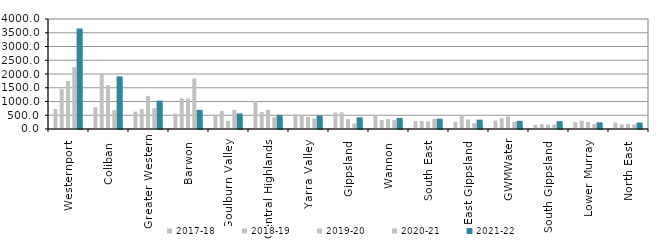
| Category | 2017-18 | 2018-19 | 2019-20 | 2020-21 | 2021-22 |
|---|---|---|---|---|---|
| Westernport  | 729.938 | 1451.118 | 1746.615 | 2248.75 | 3583.143 |
| Coliban  | 789.182 | 2020.653 | 1598.887 | 683.093 | 1841.189 |
| Greater Western | 630.923 | 725.361 | 1201.258 | 755.099 | 961.988 |
| Barwon  | 557.536 | 1117 | 1112.623 | 1837.607 | 624.006 |
| Goulburn Valley  | 487.173 | 657.018 | 297.876 | 698.438 | 494.216 |
| Central Highlands  | 1018.349 | 615.27 | 698.626 | 430.724 | 443.155 |
| Yarra Valley  | 534.077 | 485.75 | 439.076 | 382.234 | 428.816 |
| Gippsland  | 599.632 | 604.762 | 361.333 | 199.333 | 352 |
| Wannon  | 496.659 | 323.024 | 363.85 | 319.759 | 330.292 |
| South East  | 287.134 | 292.04 | 275.257 | 365.458 | 304.027 |
| East Gippsland  | 262.8 | 495.667 | 346 | 208.25 | 267 |
| GWMWater | 306.037 | 388.392 | 450.488 | 260.744 | 224.289 |
| South Gippsland  | 151.824 | 178.429 | 161.176 | 158.8 | 213 |
| Lower Murray  | 247.686 | 300.915 | 255.761 | 180.492 | 171.797 |
| North East  | 237.625 | 170.222 | 188.1 | 166.875 | 162.077 |